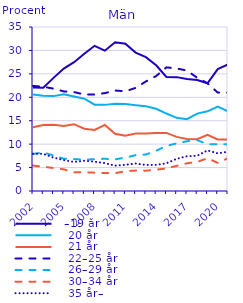
| Category |   –19 år |    20 år |    21 år |    22–25 år |    26–29 år |    30–34 år |    35 år– |
|---|---|---|---|---|---|---|---|
| 2002.0 | 22.089 | 20.613 | 13.584 | 22.429 | 7.925 | 5.428 | 7.932 |
| 2003.0 | 22.016 | 20.329 | 14.081 | 22.251 | 8.204 | 5.182 | 7.938 |
| 2004.0 | 24.146 | 20.249 | 14.135 | 21.848 | 7.601 | 4.9 | 7.12 |
| 2005.0 | 26.123 | 20.637 | 13.871 | 21.254 | 6.89 | 4.622 | 6.603 |
| 2006.0 | 27.487 | 20.155 | 14.257 | 21.108 | 6.808 | 3.989 | 6.196 |
| 2007.0 | 29.271 | 19.701 | 13.29 | 20.589 | 6.682 | 4.005 | 6.461 |
| 2008.0 | 30.982 | 18.422 | 13.04 | 20.595 | 6.791 | 3.911 | 6.259 |
| 2009.0 | 29.947 | 18.381 | 14.103 | 20.89 | 6.876 | 3.852 | 5.952 |
| 2010.0 | 31.726 | 18.636 | 12.214 | 21.446 | 6.76 | 3.809 | 5.409 |
| 2011.0 | 31.432 | 18.554 | 11.805 | 21.276 | 7.117 | 4.227 | 5.59 |
| 2012.0 | 29.532 | 18.323 | 12.264 | 22.006 | 7.656 | 4.356 | 5.863 |
| 2013.0 | 28.554 | 18.105 | 12.283 | 23.382 | 7.781 | 4.332 | 5.564 |
| 2014.0 | 26.836 | 17.541 | 12.371 | 24.538 | 8.59 | 4.554 | 5.57 |
| 2015.0 | 24.335 | 16.529 | 12.397 | 26.387 | 9.632 | 4.806 | 5.914 |
| 2016.0 | 24.301 | 15.617 | 11.546 | 26.143 | 10.162 | 5.365 | 6.865 |
| 2017.0 | 23.908 | 15.323 | 11.11 | 25.71 | 10.616 | 5.919 | 7.414 |
| 2018.0 | 23.689 | 16.512 | 11.05 | 24.163 | 10.856 | 6.209 | 7.52 |
| 2019.0 | 23 | 17 | 12 | 23 | 10 | 7 | 8.664 |
| 2020.0 | 26 | 18 | 11 | 21 | 10 | 6 | 8.034 |
| 2021.0 | 27 | 17 | 11 | 21 | 10 | 7 | 8.388 |